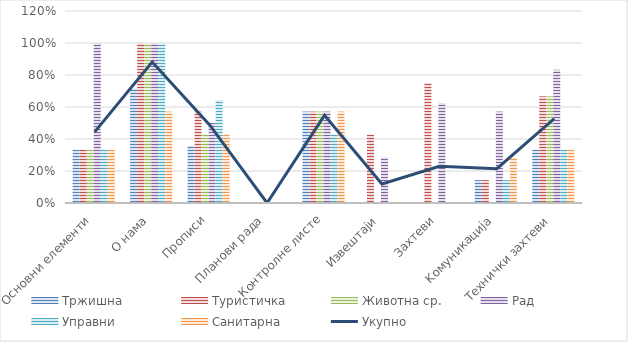
| Category | Тржишна | Туристичка | Животна ср. | Рад | Управни | Санитарна |
|---|---|---|---|---|---|---|
| Основни елементи | 0.333 | 0.333 | 0.333 | 1 | 0.333 | 0.333 |
| О нама | 0.714 | 1 | 1 | 1 | 1 | 0.571 |
| Прописи | 0.357 | 0.571 | 0.429 | 0.5 | 0.643 | 0.429 |
| Планови рада | 0 | 0 | 0 | 0 | 0 | 0 |
| Контролне листе | 0.571 | 0.571 | 0.571 | 0.571 | 0.429 | 0.571 |
| Извештаји | 0 | 0.429 | 0 | 0.286 | 0 | 0 |
| Захтеви | 0 | 0.75 | 0 | 0.625 | 0 | 0 |
| Kомуникација | 0.143 | 0.143 | 0 | 0.571 | 0.143 | 0.286 |
| Технички захтеви | 0.333 | 0.667 | 0.667 | 0.833 | 0.333 | 0.333 |